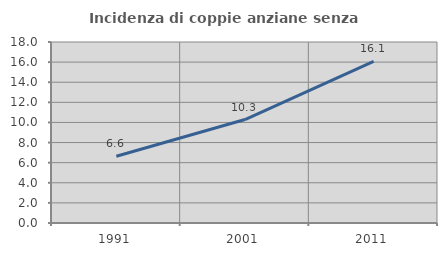
| Category | Incidenza di coppie anziane senza figli  |
|---|---|
| 1991.0 | 6.64 |
| 2001.0 | 10.291 |
| 2011.0 | 16.068 |